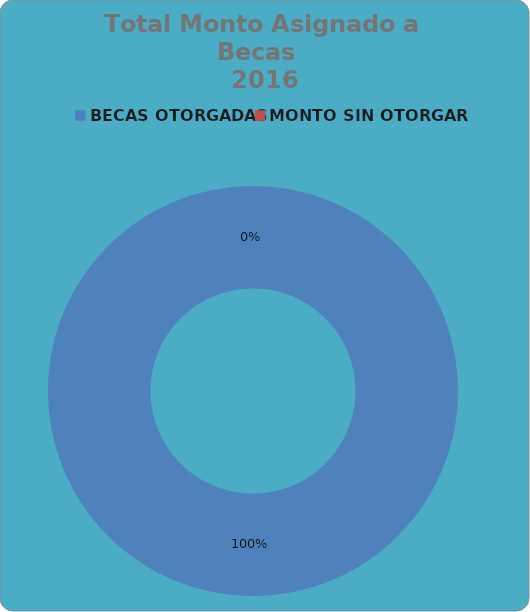
| Category | Series 0 |
|---|---|
| BECAS OTORGADAS | 1345500.002 |
| MONTO SIN OTORGAR | -0.002 |